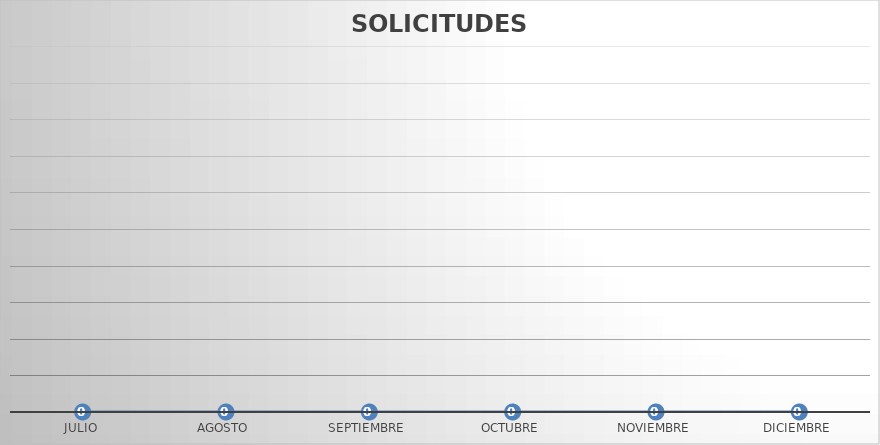
| Category | SOLICITUDES NEGADAS |
|---|---|
| JULIO | 0 |
| AGOSTO | 0 |
| SEPTIEMBRE | 0 |
| OCTUBRE | 0 |
| NOVIEMBRE | 0 |
| DICIEMBRE | 0 |